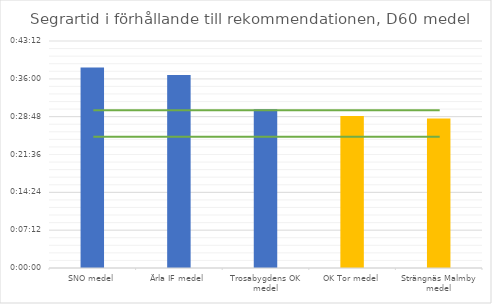
| Category | D60 tid |
|---|---|
| SNO medel | 0.026 |
| Ärla IF medel | 0.026 |
| Trosabygdens OK medel | 0.021 |
| OK Tor medel | 0.02 |
| Strängnäs Malmby medel | 0.02 |